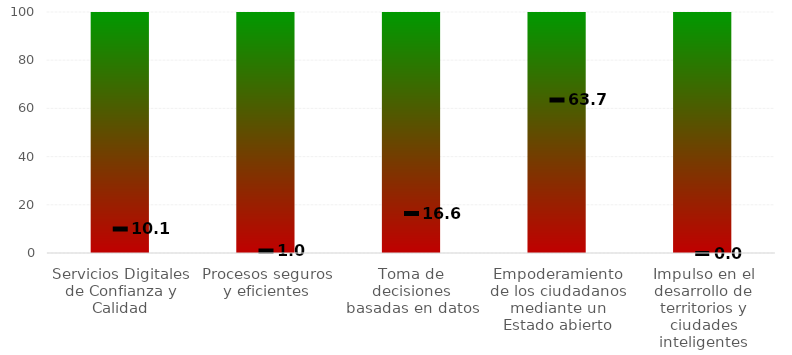
| Category | Rangos |
|---|---|
| Servicios Digitales de Confianza y Calidad | 100 |
| Procesos seguros y eficientes | 100 |
| Toma de decisiones basadas en datos | 100 |
| Empoderamiento de los ciudadanos mediante un Estado abierto | 100 |
| Impulso en el desarrollo de territorios y ciudades inteligentes | 100 |